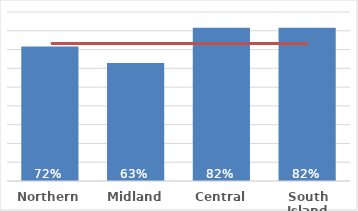
| Category | Pacific |
|---|---|
| Northern | 0.716 |
| Midland | 0.628 |
| Central | 0.816 |
| South Island | 0.817 |